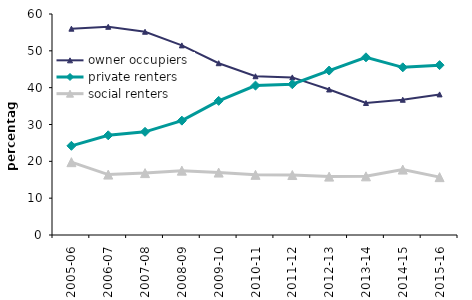
| Category | owner occupiers | private renters | social renters |
|---|---|---|---|
| 2005-06 | 56.012 | 24.212 | 19.776 |
| 2006-07 | 56.526 | 27.07 | 16.404 |
| 2007-08 | 55.179 | 28.015 | 16.806 |
| 2008-09 | 51.478 | 31.049 | 17.473 |
| 2009-10 | 46.64 | 36.411 | 16.949 |
| 2010-11 | 43.1 | 40.568 | 16.332 |
| 2011-12 | 42.786 | 40.93 | 16.284 |
| 2012-13 | 39.505 | 44.645 | 15.85 |
| 2013-14 | 35.834 | 48.238 | 15.928 |
| 2014-15 | 36.719 | 45.522 | 17.76 |
| 2015-16 | 38.173 | 46.118 | 15.71 |